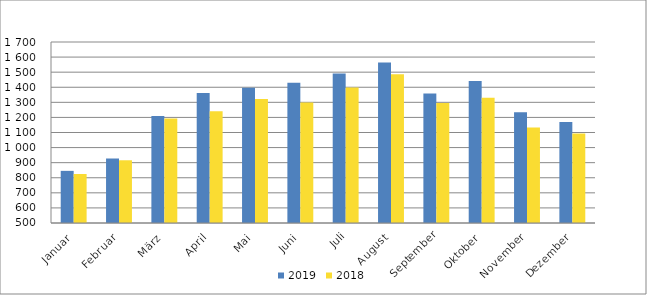
| Category | 2019 | 2018 |
|---|---|---|
| Januar | 845707 | 824777 |
| Februar | 926907 | 915853 |
| März | 1209249 | 1192189 |
| April | 1361223 | 1240759 |
| Mai | 1396422 | 1321686 |
| Juni | 1429918 | 1299390 |
| Juli | 1490543 | 1397788 |
| August | 1563959 | 1485602 |
| September | 1359152 | 1294916 |
| Oktober | 1440795 | 1330901 |
| November | 1234146 | 1132965 |
| Dezember | 1169385 | 1092723 |